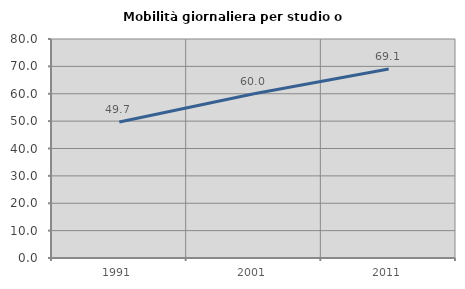
| Category | Mobilità giornaliera per studio o lavoro |
|---|---|
| 1991.0 | 49.688 |
| 2001.0 | 60 |
| 2011.0 | 69.061 |